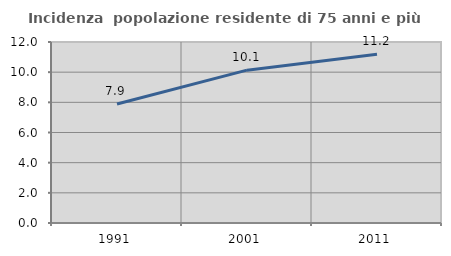
| Category | Incidenza  popolazione residente di 75 anni e più |
|---|---|
| 1991.0 | 7.886 |
| 2001.0 | 10.133 |
| 2011.0 | 11.192 |